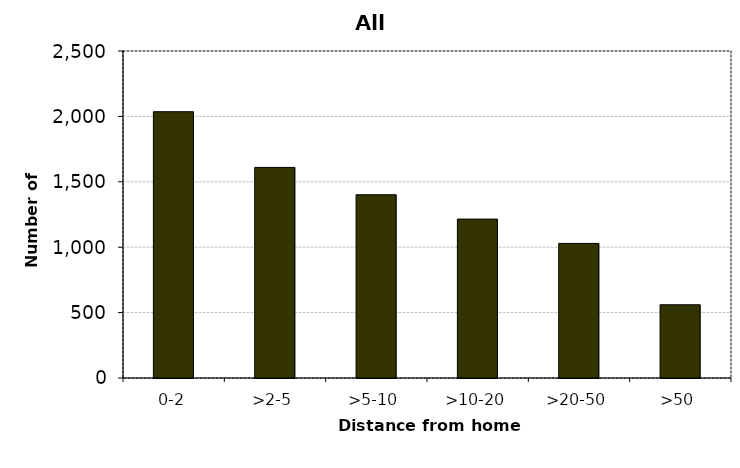
| Category | All drivers |
|---|---|
| 0-2 | 2036 |
| >2-5 | 1610 |
| >5-10 | 1401 |
| >10-20 | 1215 |
| >20-50 | 1029 |
| >50 | 560 |